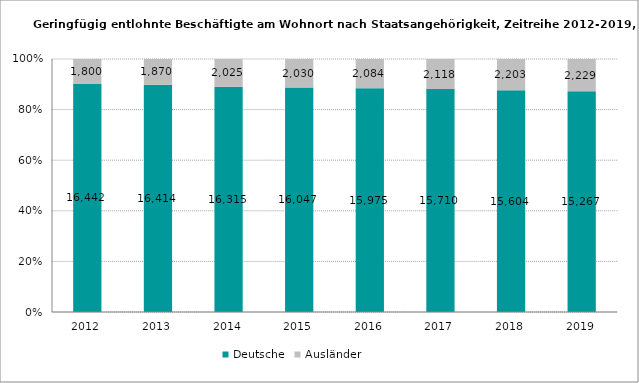
| Category | Deutsche | Ausländer |
|---|---|---|
| 2012.0 | 16442 | 1800 |
| 2013.0 | 16414 | 1870 |
| 2014.0 | 16315 | 2025 |
| 2015.0 | 16047 | 2030 |
| 2016.0 | 15975 | 2084 |
| 2017.0 | 15710 | 2118 |
| 2018.0 | 15604 | 2203 |
| 2019.0 | 15267 | 2229 |